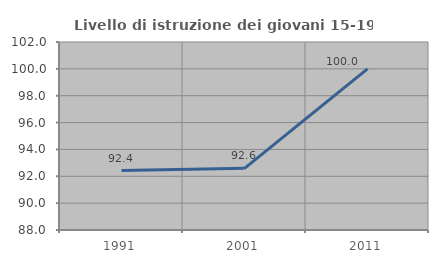
| Category | Livello di istruzione dei giovani 15-19 anni |
|---|---|
| 1991.0 | 92.424 |
| 2001.0 | 92.593 |
| 2011.0 | 100 |